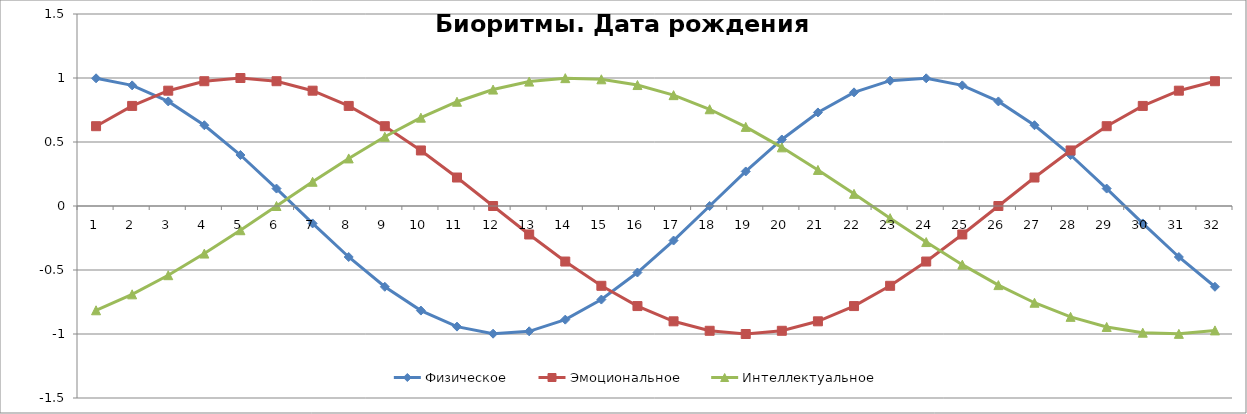
| Category | Физическое | Эмоциональное | Интеллектуальное |
|---|---|---|---|
| 0 | 0.998 | 0.623 | -0.815 |
| 1 | 0.942 | 0.782 | -0.69 |
| 2 | 0.817 | 0.901 | -0.541 |
| 3 | 0.631 | 0.975 | -0.372 |
| 4 | 0.398 | 1 | -0.189 |
| 5 | 0.136 | 0.975 | 0 |
| 6 | -0.136 | 0.901 | 0.189 |
| 7 | -0.398 | 0.782 | 0.372 |
| 8 | -0.631 | 0.623 | 0.541 |
| 9 | -0.817 | 0.434 | 0.69 |
| 10 | -0.942 | 0.223 | 0.815 |
| 11 | -0.998 | 0 | 0.91 |
| 12 | -0.979 | -0.223 | 0.972 |
| 13 | -0.888 | -0.434 | 0.999 |
| 14 | -0.731 | -0.623 | 0.99 |
| 15 | -0.52 | -0.782 | 0.945 |
| 16 | -0.27 | -0.901 | 0.866 |
| 17 | 0 | -0.975 | 0.756 |
| 18 | 0.27 | -1 | 0.618 |
| 19 | 0.52 | -0.975 | 0.458 |
| 20 | 0.731 | -0.901 | 0.282 |
| 21 | 0.888 | -0.782 | 0.095 |
| 22 | 0.979 | -0.623 | -0.095 |
| 23 | 0.998 | -0.434 | -0.282 |
| 24 | 0.942 | -0.223 | -0.458 |
| 25 | 0.817 | 0 | -0.618 |
| 26 | 0.631 | 0.223 | -0.756 |
| 27 | 0.398 | 0.434 | -0.866 |
| 28 | 0.136 | 0.623 | -0.945 |
| 29 | -0.136 | 0.782 | -0.99 |
| 30 | -0.398 | 0.901 | -0.999 |
| 31 | -0.631 | 0.975 | -0.972 |